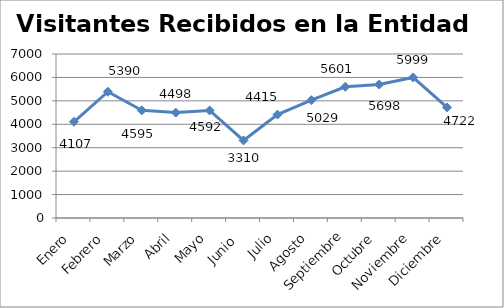
| Category | Visitantes Recibidos en la Entidad |
|---|---|
| Enero | 4107 |
| Febrero | 5390 |
| Marzo | 4595 |
| Abril  | 4498 |
| Mayo | 4592 |
| Junio  | 3310 |
| Julio | 4415.333 |
| Agosto | 5029 |
| Septiembre | 5601 |
| Octubre | 5698 |
| Noviembre | 5999 |
| Diciembre | 4722 |